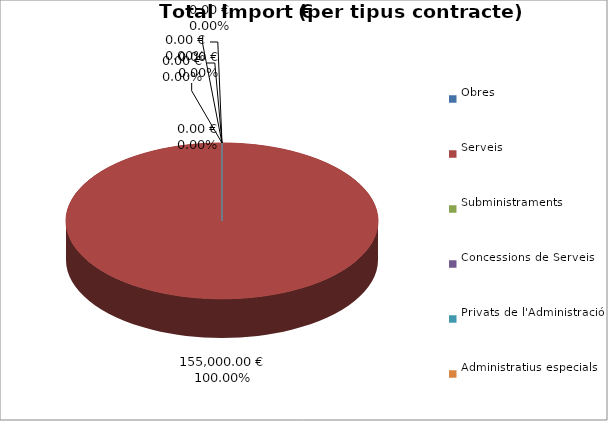
| Category | Total preu
(amb IVA) |
|---|---|
| Obres | 0 |
| Serveis | 155000 |
| Subministraments | 0 |
| Concessions de Serveis | 0 |
| Privats de l'Administració | 0 |
| Administratius especials | 0 |